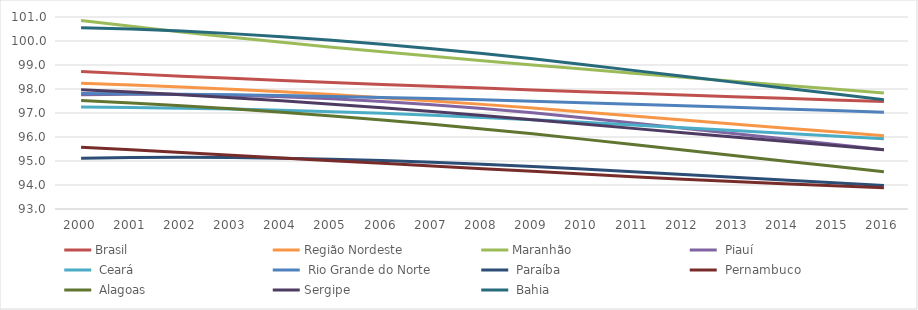
| Category | Brasil | Região Nordeste | Maranhão |  Piauí |  Ceará |  Rio Grande do Norte |  Paraíba |  Pernambuco |  Alagoas | Sergipe |  Bahia |
|---|---|---|---|---|---|---|---|---|---|---|---|
| 2000.0 | 98.729 | 98.244 | 100.859 | 97.762 | 97.246 | 97.808 | 95.115 | 95.577 | 97.519 | 97.972 | 100.557 |
| 2001.0 | 98.63 | 98.17 | 100.61 | 97.783 | 97.228 | 97.798 | 95.144 | 95.464 | 97.417 | 97.873 | 100.496 |
| 2002.0 | 98.535 | 98.085 | 100.377 | 97.775 | 97.2 | 97.78 | 95.152 | 95.352 | 97.302 | 97.762 | 100.413 |
| 2003.0 | 98.445 | 97.989 | 100.156 | 97.742 | 97.162 | 97.757 | 95.142 | 95.239 | 97.174 | 97.64 | 100.307 |
| 2004.0 | 98.358 | 97.883 | 99.946 | 97.681 | 97.113 | 97.727 | 95.116 | 95.127 | 97.033 | 97.508 | 100.18 |
| 2005.0 | 98.273 | 97.767 | 99.744 | 97.593 | 97.054 | 97.691 | 95.074 | 95.015 | 96.879 | 97.367 | 100.033 |
| 2006.0 | 98.192 | 97.64 | 99.55 | 97.481 | 96.985 | 97.649 | 95.018 | 94.903 | 96.712 | 97.217 | 99.866 |
| 2007.0 | 98.113 | 97.504 | 99.363 | 97.346 | 96.906 | 97.603 | 94.948 | 94.792 | 96.531 | 97.06 | 99.68 |
| 2008.0 | 98.037 | 97.359 | 99.182 | 97.188 | 96.817 | 97.551 | 94.866 | 94.68 | 96.338 | 96.895 | 99.477 |
| 2009.0 | 97.963 | 97.205 | 99.004 | 97.007 | 96.719 | 97.494 | 94.771 | 94.568 | 96.132 | 96.722 | 99.257 |
| 2010.0 | 97.89 | 97.042 | 98.83 | 96.804 | 96.611 | 97.432 | 94.663 | 94.455 | 95.912 | 96.542 | 99.021 |
| 2011.0 | 97.819 | 96.874 | 98.659 | 96.587 | 96.498 | 97.367 | 94.549 | 94.345 | 95.685 | 96.36 | 98.776 |
| 2012.0 | 97.749 | 96.707 | 98.49 | 96.367 | 96.384 | 97.301 | 94.434 | 94.241 | 95.457 | 96.179 | 98.531 |
| 2013.0 | 97.68 | 96.541 | 98.323 | 96.146 | 96.269 | 97.234 | 94.319 | 94.144 | 95.23 | 95.999 | 98.286 |
| 2014.0 | 97.613 | 96.377 | 98.158 | 95.922 | 96.154 | 97.168 | 94.205 | 94.053 | 95.003 | 95.82 | 98.042 |
| 2015.0 | 97.546 | 96.215 | 97.996 | 95.697 | 96.039 | 97.101 | 94.092 | 93.968 | 94.777 | 95.644 | 97.799 |
| 2016.0 | 97.481 | 96.054 | 97.834 | 95.468 | 95.924 | 97.033 | 93.98 | 93.889 | 94.552 | 95.47 | 97.556 |